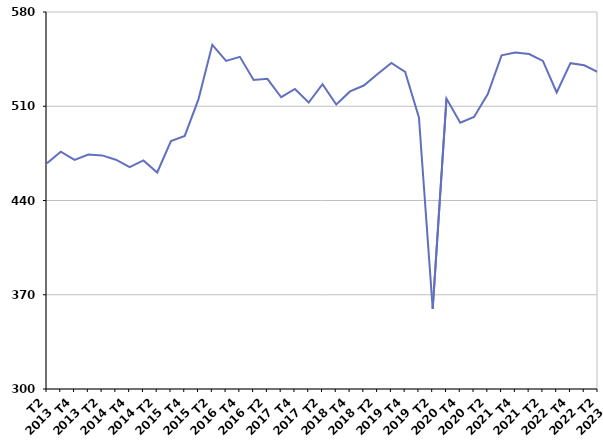
| Category | Ensemble des sorties de catégories A, B, C |
|---|---|
| T2
2013 | 467.6 |
| T3
2013 | 476.3 |
| T4
2013 | 470.1 |
| T1
2014 | 474.2 |
| T2
2014 | 473.5 |
| T3
2014 | 470.3 |
| T4
2014 | 464.7 |
| T1
2015 | 469.8 |
| T2
2015 | 460.8 |
| T3
2015 | 484.2 |
| T4
2015 | 488 |
| T1
2016 | 515.3 |
| T2
2016 | 555.6 |
| T3
2016 | 543.7 |
| T4
2016 | 546.7 |
| T1
2017 | 529.5 |
| T2
2017 | 530.4 |
| T3
2017 | 516.7 |
| T4
2017 | 522.8 |
| T1
2018 | 512.8 |
| T2
2018 | 526.4 |
| T3
2018 | 511.3 |
| T4
2018 | 521 |
| T1
2019 | 525.4 |
| T2
2019 | 533.9 |
| T3
2019 | 542.1 |
| T4
2019 | 535.5 |
| T1
2020 | 501.7 |
| T2
2020 | 359.6 |
| T3
2020 | 515.7 |
| T4
2020 | 497.8 |
| T1
2021 | 502 |
| T2
2021 | 519.1 |
| T3
2021 | 547.8 |
| T4
2021 | 549.9 |
| T1
2022 | 548.8 |
| T2
2022 | 543.7 |
| T3
2022 | 520.2 |
| T4
2022 | 542 |
| T1
2023 | 540.4 |
| T2
2023 | 535.3 |